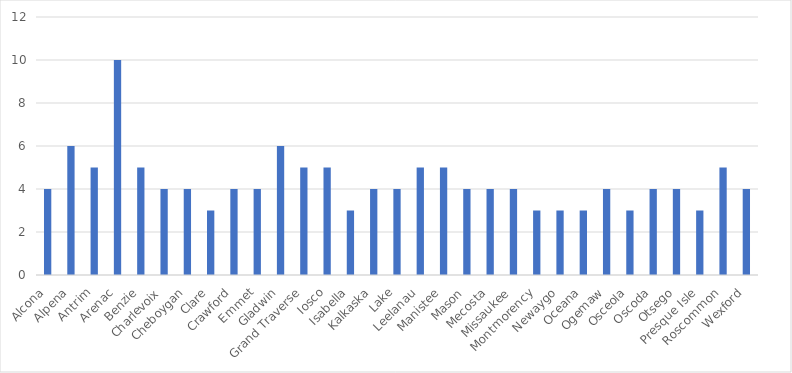
| Category | Number of Responses |
|---|---|
| Alcona | 4 |
| Alpena | 6 |
| Antrim | 5 |
| Arenac | 10 |
| Benzie | 5 |
| Charlevoix | 4 |
| Cheboygan | 4 |
| Clare | 3 |
| Crawford | 4 |
| Emmet | 4 |
| Gladwin | 6 |
| Grand Traverse | 5 |
| Iosco | 5 |
| Isabella | 3 |
| Kalkaska | 4 |
| Lake | 4 |
| Leelanau | 5 |
| Manistee | 5 |
| Mason | 4 |
| Mecosta | 4 |
| Missaukee | 4 |
| Montmorency | 3 |
| Newaygo | 3 |
| Oceana | 3 |
| Ogemaw | 4 |
| Osceola | 3 |
| Oscoda | 4 |
| Otsego | 4 |
| Presque Isle | 3 |
| Roscommon | 5 |
| Wexford | 4 |